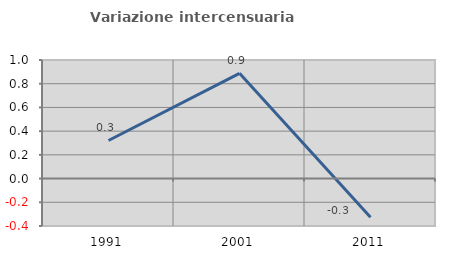
| Category | Variazione intercensuaria annua |
|---|---|
| 1991.0 | 0.321 |
| 2001.0 | 0.888 |
| 2011.0 | -0.326 |